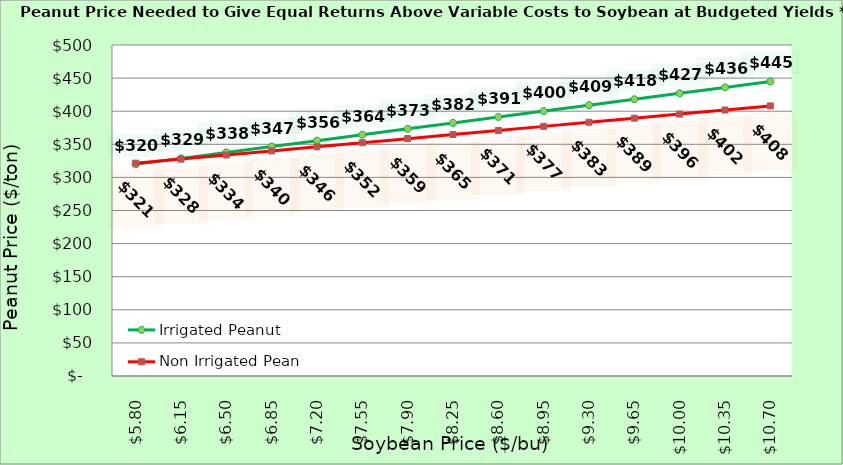
| Category | Irrigated Peanut | Non Irrigated Peanut |
|---|---|---|
| 5.8000000000000025 | 319.786 | 321.494 |
| 6.150000000000002 | 328.722 | 327.67 |
| 6.500000000000002 | 337.659 | 333.847 |
| 6.850000000000001 | 346.595 | 340.023 |
| 7.200000000000001 | 355.531 | 346.2 |
| 7.550000000000001 | 364.467 | 352.376 |
| 7.9 | 373.403 | 358.553 |
| 8.25 | 382.34 | 364.729 |
| 8.6 | 391.276 | 370.906 |
| 8.95 | 400.212 | 377.082 |
| 9.299999999999999 | 409.148 | 383.258 |
| 9.649999999999999 | 418.084 | 389.435 |
| 9.999999999999998 | 427.02 | 395.611 |
| 10.349999999999998 | 435.957 | 401.788 |
| 10.699999999999998 | 444.893 | 407.964 |